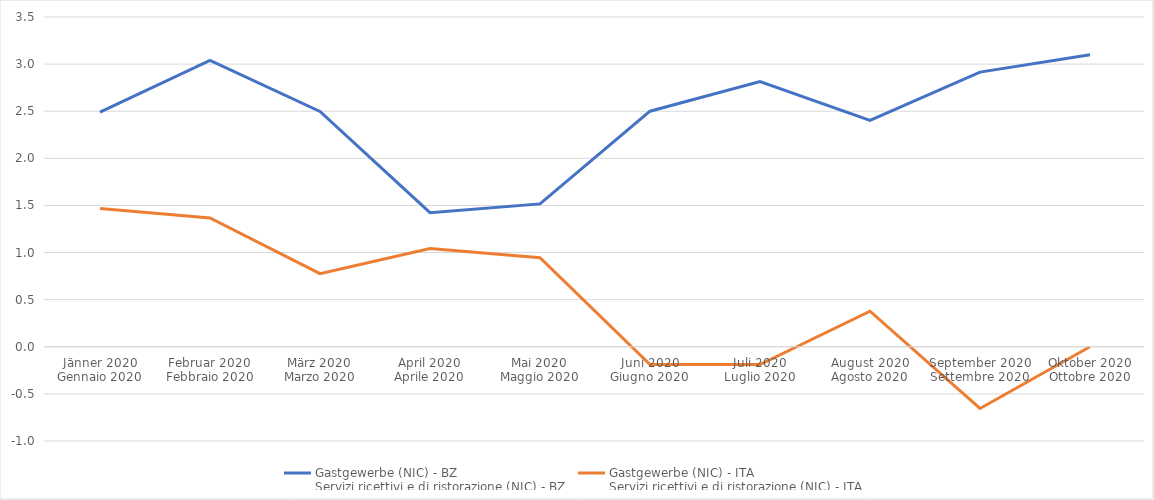
| Category | Gastgewerbe (NIC) - BZ
Servizi ricettivi e di ristorazione (NIC) - BZ | Gastgewerbe (NIC) - ITA
Servizi ricettivi e di ristorazione (NIC) - ITA |
|---|---|---|
| Jänner 2020
Gennaio 2020 | 2.491 | 1.468 |
| Februar 2020
Febbraio 2020 | 3.038 | 1.367 |
| März 2020
Marzo 2020 | 2.498 | 0.777 |
| April 2020
Aprile 2020 | 1.423 | 1.044 |
| Mai 2020
Maggio 2020 | 1.517 | 0.945 |
| Juni 2020
Giugno 2020 | 2.5 | -0.189 |
| Juli 2020
Luglio 2020 | 2.814 | -0.188 |
| August 2020
Agosto 2020 | 2.403 | 0.377 |
| September 2020
Settembre 2020 | 2.915 | -0.655 |
| Oktober 2020
Ottobre 2020 | 3.1 | 0 |